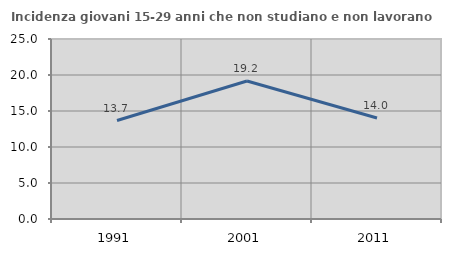
| Category | Incidenza giovani 15-29 anni che non studiano e non lavorano  |
|---|---|
| 1991.0 | 13.676 |
| 2001.0 | 19.162 |
| 2011.0 | 14.029 |